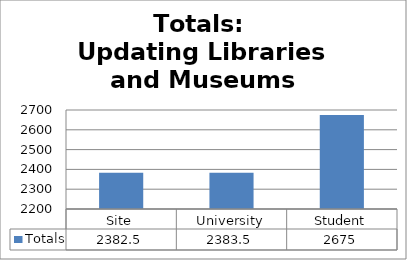
| Category | Totals |
|---|---|
| Site | 2382.5 |
| University | 2383.5 |
| Student | 2675 |